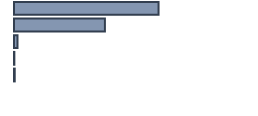
| Category | Percentatge |
|---|---|
| 0 | 60.227 |
| 1 | 37.879 |
| 2 | 1.439 |
| 3 | 0.152 |
| 4 | 0.303 |
| 5 | 0 |